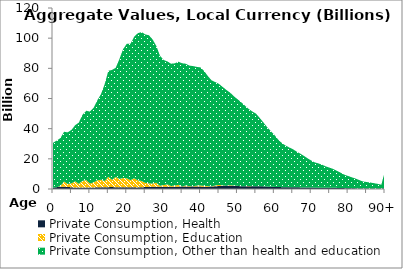
| Category | Private Consumption, Health | Private Consumption, Education | Private Consumption, Other than health and education |
|---|---|---|---|
| 0 | 858.338 | 0 | 29793.957 |
|  | 1225.697 | 0 | 30865.821 |
| 2 | 1443.489 | 454.168 | 31836.432 |
| 3 | 1504.774 | 3427.213 | 33008.149 |
| 4 | 1377.561 | 1913.456 | 34255.725 |
| 5 | 1146.46 | 2621.241 | 35427.846 |
| 6 | 954.183 | 4129.903 | 37192.702 |
| 7 | 927.917 | 2526.547 | 40583.357 |
| 8 | 933.351 | 4459.904 | 43826.635 |
| 9 | 940.011 | 4961.729 | 45953.587 |
| 10 | 911.003 | 2704.61 | 47726.992 |
| 11 | 993.537 | 3315.951 | 49561.696 |
| 12 | 1167.123 | 4593.068 | 52968.266 |
| 13 | 1193.764 | 4913.662 | 56787.583 |
| 14 | 1206.697 | 4087.001 | 64165.593 |
| 15 | 1226.324 | 6884.605 | 70244.883 |
| 16 | 1288.06 | 4811.529 | 72837.511 |
| 17 | 1161.77 | 6847.442 | 72336.816 |
| 18 | 1146.803 | 5574.707 | 79413.547 |
| 19 | 1125.754 | 6150.372 | 85418.262 |
| 20 | 1219.586 | 5924.003 | 89202.537 |
| 21 | 1170.734 | 4678.371 | 90373.211 |
| 22 | 1089.052 | 6067.916 | 93819.873 |
| 23 | 1065.034 | 4658.201 | 97571.825 |
| 24 | 1143.166 | 4186.258 | 98736.362 |
| 25 | 1286.571 | 2810.808 | 98436.9 |
| 26 | 1444.472 | 2280.965 | 98203.489 |
| 27 | 1516.174 | 2055.578 | 95592.837 |
| 28 | 1534.813 | 2642.734 | 90735.556 |
| 29 | 1529.291 | 622.389 | 86223.904 |
| 30 | 1487.508 | 1114.285 | 82929.987 |
| 31 | 1508.385 | 1547.433 | 81526.635 |
| 32 | 1552.558 | 448.301 | 81074.485 |
| 33 | 1550.075 | 700.525 | 81060.119 |
| 34 | 1562.074 | 1199.284 | 81609.346 |
| 35 | 1615.933 | 106.489 | 81630.125 |
| 36 | 1623.759 | 690.193 | 80742.75 |
| 37 | 1608.346 | 315.578 | 79907.144 |
| 38 | 1615.653 | 257.245 | 79593.811 |
| 39 | 1631.171 | 628.132 | 78689.05 |
| 40 | 1582.044 | 712.662 | 78303.3 |
| 41 | 1506.417 | 578.061 | 76041.498 |
| 42 | 1495.17 | 422.548 | 72905.97 |
| 43 | 1637.748 | 140.429 | 70229.783 |
| 44 | 1810.7 | 553.19 | 68521.324 |
| 45 | 1968.469 | 760.795 | 66923.412 |
| 46 | 2141.633 | 239.676 | 65277.517 |
| 47 | 2160.738 | 16.59 | 63486.298 |
| 48 | 2111.503 | 454.507 | 61346.96 |
| 49 | 2048.021 | 245.118 | 59251.864 |
| 50 | 1959.09 | 137.525 | 57479.895 |
| 51 | 1854.769 | 0 | 55711.603 |
| 52 | 1827.184 | 51.218 | 53504.128 |
| 53 | 1851.749 | 112.086 | 51215.393 |
| 54 | 1885.697 | 0 | 49542.755 |
| 55 | 1905.731 | 0 | 48121.357 |
| 56 | 1838.256 | 0 | 45428.296 |
| 57 | 1729.697 | 0 | 42539.65 |
| 58 | 1597.609 | 1.73 | 39566.969 |
| 59 | 1487.561 | 12.862 | 37010.095 |
| 60 | 1397.709 | 3.908 | 34528.365 |
| 61 | 1301.509 | 0 | 31599.886 |
| 62 | 1227.921 | 0 | 29320.522 |
| 63 | 1192.411 | 0 | 27703.332 |
| 64 | 1172.257 | 0 | 26417.384 |
| 65 | 1155.462 | 0 | 25306.271 |
| 66 | 1103.88 | 0 | 23759.496 |
| 67 | 1072.228 | 0 | 22425.763 |
| 68 | 1028.865 | 0 | 20961.628 |
| 69 | 975.205 | 0 | 19393.179 |
| 70 | 929.875 | 0 | 17939.463 |
| 71 | 897.871 | 0 | 16734.375 |
| 72 | 895.105 | 0 | 16035.147 |
| 73 | 883.438 | 0 | 15164.752 |
| 74 | 853.809 | 0 | 14114.7 |
| 75 | 833.9 | 0 | 13309.698 |
| 76 | 803.517 | 0 | 12426.678 |
| 77 | 744.564 | 0 | 11244.586 |
| 78 | 659.33 | 0 | 10094.74 |
| 79 | 576.327 | 0 | 8907.036 |
| 80 | 515.231 | 0 | 8094.382 |
| 81 | 458.623 | 0 | 7312.467 |
| 82 | 405.278 | 0 | 6545.008 |
| 83 | 342.409 | 0 | 5611.377 |
| 84 | 283.646 | 0 | 4719.391 |
| 85 | 259.319 | 0 | 4385.392 |
| 86 | 235.997 | 0 | 4083.033 |
| 87 | 206.134 | 0 | 3653.724 |
| 88 | 178.449 | 0 | 3234.527 |
| 89 | 146.693 | 0 | 2721.033 |
| 90+ | 586.978 | 0 | 11231.28 |